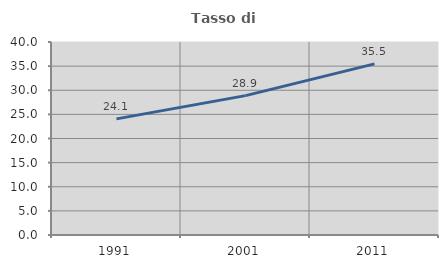
| Category | Tasso di occupazione   |
|---|---|
| 1991.0 | 24.065 |
| 2001.0 | 28.888 |
| 2011.0 | 35.474 |